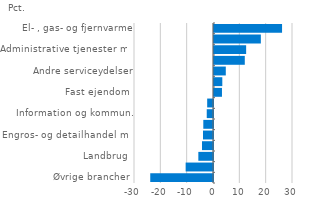
| Category | Series 0 |
|---|---|
| Øvrige brancher | -23.83 |
| Kultur, forlystelser mv. | -10.39 |
| Landbrug | -5.569 |
| Sundhedsvæsen mv. | -4.182 |
| Engros- og detailhandel mv. | -3.798 |
| Liberale tjenester mv. | -3.683 |
| Information og kommun. | -2.376 |
| Hotel og restauration | -2.211 |
| Fast ejendom | 3.026 |
| Bygge og anlæg | 3.157 |
| Andre serviceydelser | 4.479 |
| Transport og gods | 11.692 |
| Administrative tjenester mv. | 12.204 |
| Fremstillingsvirksomhed | 17.793 |
| El- , gas- og fjernvarme | 25.844 |